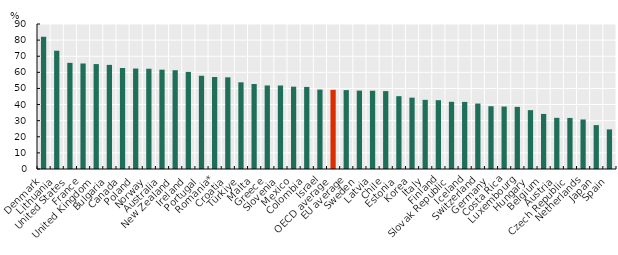
| Category | Series 0 |
|---|---|
| Denmark | 82.028 |
| Lithuania | 73.418 |
| United States | 65.895 |
| France | 65.493 |
| United Kingdom | 65.126 |
| Bulgaria | 64.629 |
| Canada | 62.704 |
| Poland | 62.362 |
| Norway | 62.237 |
| Australia | 61.656 |
| New Zealand | 61.314 |
| Ireland | 60.273 |
| Portugal | 57.874 |
| Romania* | 57.087 |
| Croatia | 56.911 |
| Türkiye | 53.802 |
| Malta | 52.763 |
| Greece | 51.842 |
| Slovenia | 51.831 |
| Mexico | 51.102 |
| Colombia | 50.94 |
| Israel | 49.3 |
| OECD average | 49.129 |
| EU average | 48.973 |
| Sweden | 48.663 |
| Latvia | 48.586 |
| Chile | 48.355 |
| Estonia | 45.202 |
| Korea | 44.293 |
| Italy | 42.921 |
| Finland | 42.72 |
| Slovak Republic | 41.711 |
| Iceland | 41.64 |
| Switzerland | 40.62 |
| Germany | 38.948 |
| Costa Rica | 38.761 |
| Luxembourg | 38.561 |
| Hungary | 36.534 |
| Belgium | 34.181 |
| Austria | 31.756 |
| Czech Republic | 31.685 |
| Netherlands | 30.733 |
| Japan | 27.24 |
| Spain | 24.586 |